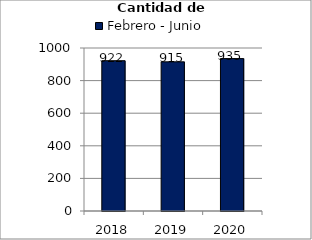
| Category | Febrero - Junio |
|---|---|
| 2018.0 | 922 |
| 2019.0 | 915 |
| 2020.0 | 935 |